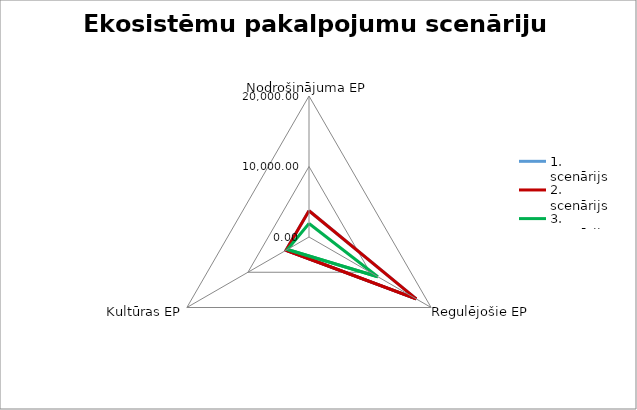
| Category | 1. scenārijs | 2. scenārijs | 3. scenārijs |
|---|---|---|---|
| Nodrošinājuma EP | 3721.423 | 3721.423 | 1913.519 |
| Regulējošie EP | 17558.851 | 17558.851 | 11264.274 |
| Kultūras EP | 3760.216 | 3760.216 | 3531.316 |